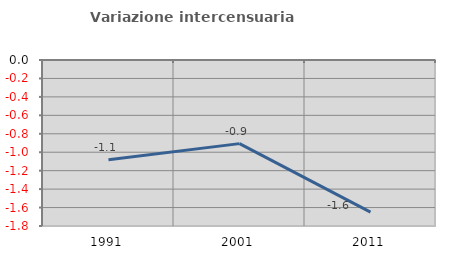
| Category | Variazione intercensuaria annua |
|---|---|
| 1991.0 | -1.081 |
| 2001.0 | -0.907 |
| 2011.0 | -1.649 |